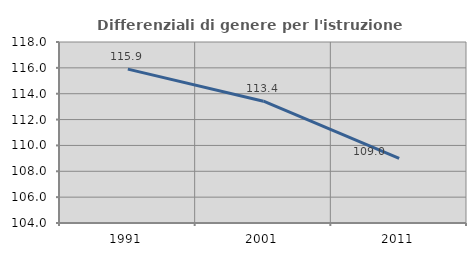
| Category | Differenziali di genere per l'istruzione superiore |
|---|---|
| 1991.0 | 115.901 |
| 2001.0 | 113.42 |
| 2011.0 | 109.003 |